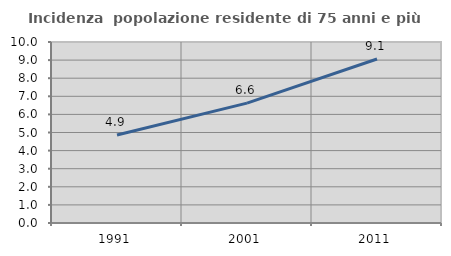
| Category | Incidenza  popolazione residente di 75 anni e più |
|---|---|
| 1991.0 | 4.866 |
| 2001.0 | 6.621 |
| 2011.0 | 9.06 |